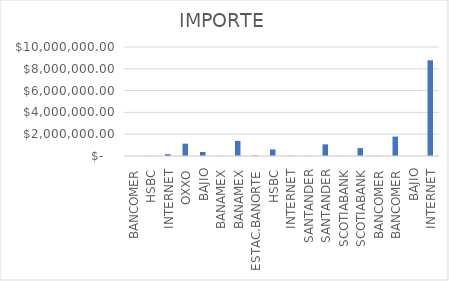
| Category | IMPORTE |
|---|---|
| BANCOMER | 2353 |
| HSBC | 8682.86 |
| INTERNET | 168045.69 |
| OXXO | 1130456.32 |
| BAJIO | 366307.67 |
| BANAMEX | 14155.92 |
| BANAMEX | 1388354.66 |
| ESTAC.BANORTE | 44459.5 |
| HSBC | 602410.37 |
| INTERNET | 31954.9 |
| SANTANDER | 17218.68 |
| SANTANDER | 1068591.9 |
| SCOTIABANK | 8525.95 |
| SCOTIABANK | 726182.42 |
| BANCOMER | 22498.99 |
| BANCOMER | 1780518.11 |
| BAJIO | 368.04 |
| INTERNET | 8777927.91 |